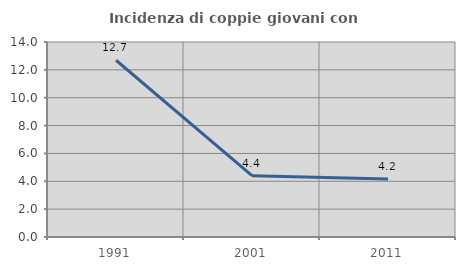
| Category | Incidenza di coppie giovani con figli |
|---|---|
| 1991.0 | 12.69 |
| 2001.0 | 4.405 |
| 2011.0 | 4.167 |